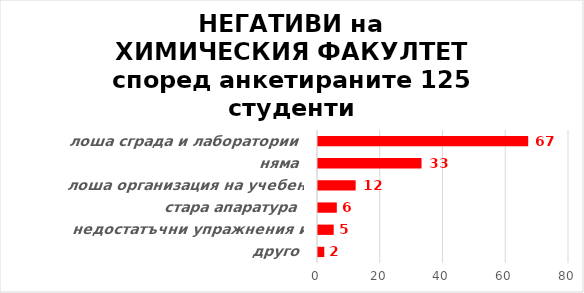
| Category | Series 0 |
|---|---|
| друго | 2 |
| недостатъчни упражнения и практика | 5 |
| стара апаратура | 6 |
| лоша организация на учебен процес | 12 |
| няма | 33 |
| лоша сграда и лаборатории | 67 |